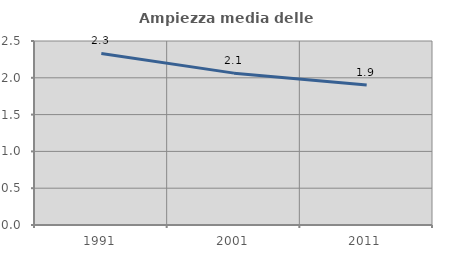
| Category | Ampiezza media delle famiglie |
|---|---|
| 1991.0 | 2.331 |
| 2001.0 | 2.063 |
| 2011.0 | 1.904 |